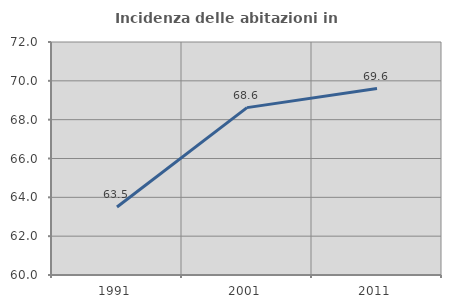
| Category | Incidenza delle abitazioni in proprietà  |
|---|---|
| 1991.0 | 63.501 |
| 2001.0 | 68.621 |
| 2011.0 | 69.601 |